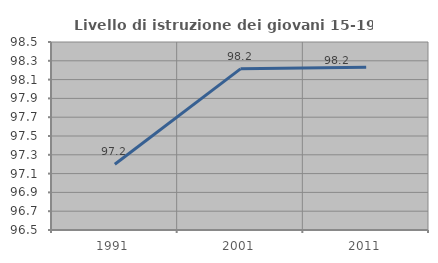
| Category | Livello di istruzione dei giovani 15-19 anni |
|---|---|
| 1991.0 | 97.199 |
| 2001.0 | 98.214 |
| 2011.0 | 98.233 |